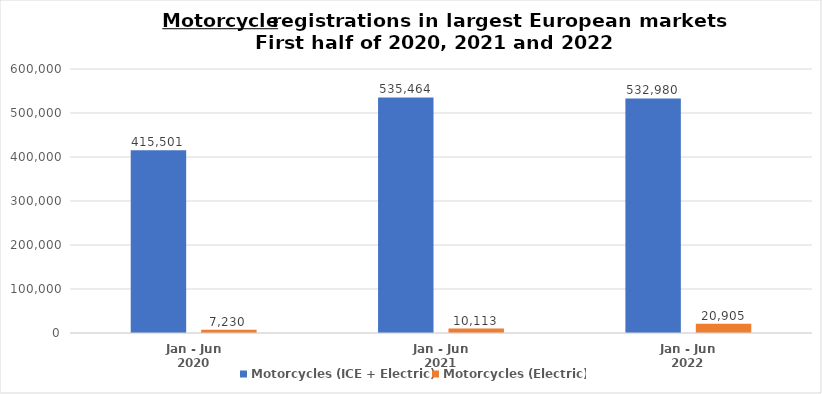
| Category | Motorcycles (ICE + Electric)  | Motorcycles (Electric)  |
|---|---|---|
| Jan - Jun 2020 | 415501 | 7230 |
| Jan - Jun 2021 | 535464 | 10113 |
| Jan - Jun 2022 | 532980 | 20905 |